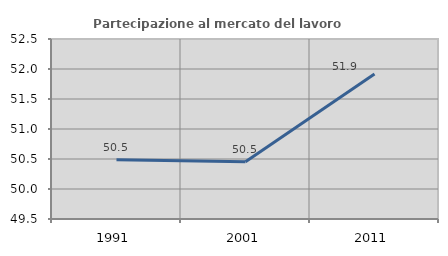
| Category | Partecipazione al mercato del lavoro  femminile |
|---|---|
| 1991.0 | 50.488 |
| 2001.0 | 50.454 |
| 2011.0 | 51.917 |